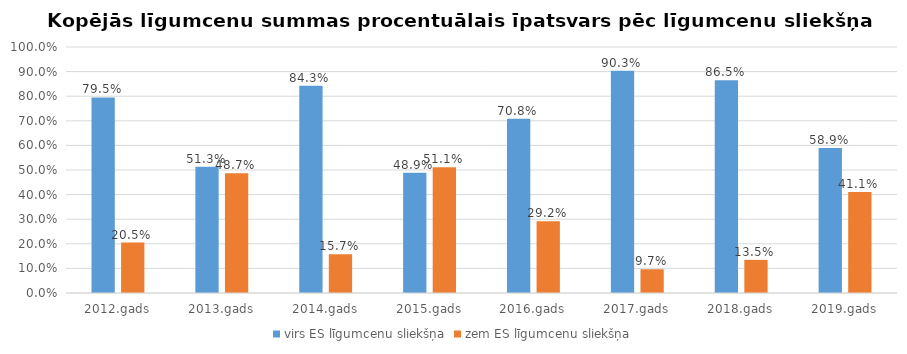
| Category | virs ES līgumcenu sliekšņa | zem ES līgumcenu sliekšņa |
|---|---|---|
| 2012.gads | 0.795 | 0.205 |
| 2013.gads | 0.513 | 0.487 |
| 2014.gads | 0.843 | 0.157 |
| 2015.gads | 0.489 | 0.511 |
| 2016.gads | 0.708 | 0.292 |
| 2017.gads | 0.903 | 0.097 |
| 2018.gads | 0.865 | 0.135 |
| 2019.gads | 0.589 | 0.411 |